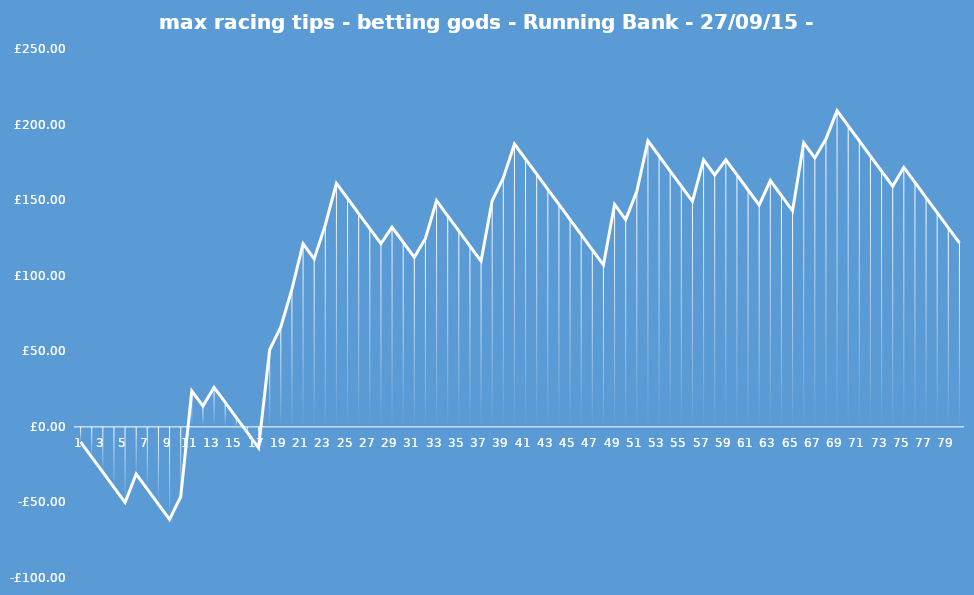
| Category | Running Bank |
|---|---|
| 0 | -10 |
| 1 | -20 |
| 2 | -30 |
| 3 | -40 |
| 4 | -50 |
| 5 | -31.233 |
| 6 | -41.233 |
| 7 | -51.233 |
| 8 | -61.233 |
| 9 | -46.233 |
| 10 | 23.767 |
| 11 | 13.767 |
| 12 | 26.142 |
| 13 | 16.142 |
| 14 | 6.142 |
| 15 | -3.858 |
| 16 | -13.858 |
| 17 | 51.142 |
| 18 | 66.142 |
| 19 | 91.142 |
| 20 | 121.142 |
| 21 | 111.142 |
| 22 | 133.642 |
| 23 | 161.142 |
| 24 | 151.142 |
| 25 | 141.142 |
| 26 | 131.142 |
| 27 | 121.142 |
| 28 | 132.142 |
| 29 | 122.142 |
| 30 | 112.142 |
| 31 | 124.642 |
| 32 | 149.642 |
| 33 | 139.642 |
| 34 | 129.642 |
| 35 | 119.642 |
| 36 | 109.642 |
| 37 | 149.642 |
| 38 | 164.642 |
| 39 | 187.142 |
| 40 | 177.142 |
| 41 | 167.142 |
| 42 | 157.142 |
| 43 | 147.142 |
| 44 | 137.142 |
| 45 | 127.142 |
| 46 | 117.142 |
| 47 | 107.142 |
| 48 | 147.142 |
| 49 | 137.142 |
| 50 | 155.902 |
| 51 | 189.202 |
| 52 | 179.202 |
| 53 | 169.202 |
| 54 | 159.202 |
| 55 | 149.202 |
| 56 | 176.702 |
| 57 | 166.702 |
| 58 | 176.702 |
| 59 | 166.702 |
| 60 | 156.702 |
| 61 | 146.702 |
| 62 | 162.952 |
| 63 | 152.952 |
| 64 | 142.952 |
| 65 | 187.952 |
| 66 | 177.952 |
| 67 | 190.452 |
| 68 | 209.185 |
| 69 | 199.185 |
| 70 | 189.185 |
| 71 | 179.185 |
| 72 | 169.185 |
| 73 | 159.185 |
| 74 | 171.685 |
| 75 | 161.685 |
| 76 | 151.685 |
| 77 | 141.685 |
| 78 | 131.685 |
| 79 | 121.685 |